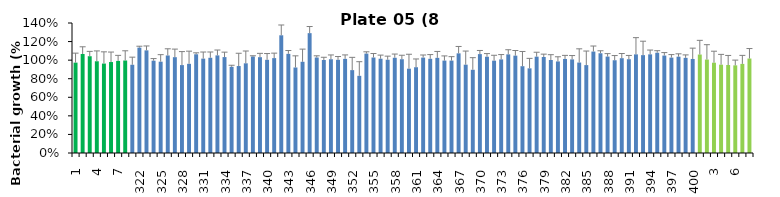
| Category | 8 h % |
|---|---|
| 1.0 | 0.973 |
| 2.0 | 1.066 |
| 3.0 | 1.042 |
| 4.0 | 0.988 |
| 5.0 | 0.963 |
| 6.0 | 0.98 |
| 7.0 | 0.992 |
| 8.0 | 0.996 |
| 321.0 | 0.95 |
| 322.0 | 1.135 |
| 323.0 | 1.105 |
| 324.0 | 0.994 |
| 325.0 | 0.983 |
| 326.0 | 1.05 |
| 327.0 | 1.032 |
| 328.0 | 0.947 |
| 329.0 | 0.96 |
| 330.0 | 1.063 |
| 331.0 | 1.016 |
| 332.0 | 1.026 |
| 333.0 | 1.051 |
| 334.0 | 1.033 |
| 335.0 | 0.928 |
| 336.0 | 0.937 |
| 337.0 | 0.966 |
| 338.0 | 1.039 |
| 339.0 | 1.032 |
| 340.0 | 1.004 |
| 341.0 | 1.022 |
| 342.0 | 1.268 |
| 343.0 | 1.068 |
| 344.0 | 0.921 |
| 345.0 | 0.982 |
| 346.0 | 1.291 |
| 347.0 | 1.028 |
| 348.0 | 1.002 |
| 349.0 | 1.01 |
| 350.0 | 1.004 |
| 351.0 | 1.014 |
| 352.0 | 0.893 |
| 353.0 | 0.831 |
| 354.0 | 1.071 |
| 355.0 | 1.028 |
| 356.0 | 1.015 |
| 357.0 | 1.004 |
| 358.0 | 1.026 |
| 359.0 | 1.01 |
| 360.0 | 0.908 |
| 361.0 | 0.924 |
| 362.0 | 1.027 |
| 363.0 | 1.015 |
| 364.0 | 1.025 |
| 365.0 | 0.995 |
| 366.0 | 0.995 |
| 367.0 | 1.073 |
| 368.0 | 0.951 |
| 369.0 | 0.896 |
| 370.0 | 1.065 |
| 371.0 | 1.037 |
| 372.0 | 0.994 |
| 373.0 | 1.008 |
| 374.0 | 1.062 |
| 375.0 | 1.049 |
| 376.0 | 0.935 |
| 377.0 | 0.912 |
| 378.0 | 1.037 |
| 379.0 | 1.034 |
| 380.0 | 1.002 |
| 381.0 | 0.986 |
| 382.0 | 1.013 |
| 383.0 | 1.008 |
| 384.0 | 0.974 |
| 385.0 | 0.947 |
| 386.0 | 1.093 |
| 387.0 | 1.074 |
| 388.0 | 1.038 |
| 389.0 | 0.999 |
| 390.0 | 1.021 |
| 391.0 | 1.01 |
| 392.0 | 1.062 |
| 393.0 | 1.054 |
| 394.0 | 1.062 |
| 395.0 | 1.08 |
| 396.0 | 1.049 |
| 397.0 | 1.027 |
| 398.0 | 1.037 |
| 399.0 | 1.025 |
| 400.0 | 1.013 |
| 1.0 | 1.06 |
| 2.0 | 1.006 |
| 3.0 | 0.972 |
| 4.0 | 0.951 |
| 5.0 | 0.948 |
| 6.0 | 0.944 |
| 7.0 | 0.96 |
| 8.0 | 1.017 |